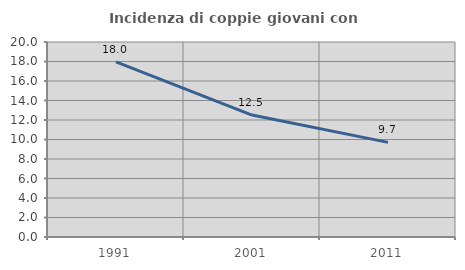
| Category | Incidenza di coppie giovani con figli |
|---|---|
| 1991.0 | 17.968 |
| 2001.0 | 12.509 |
| 2011.0 | 9.707 |